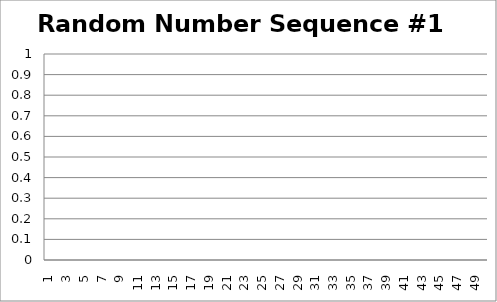
| Category | Random Number Sequence #1 |
|---|---|
| 1.0 | 0 |
| 2.0 | 0 |
| 3.0 | 0 |
| 4.0 | 0 |
| 5.0 | 0 |
| 6.0 | 0 |
| 7.0 | 0 |
| 8.0 | 0 |
| 9.0 | 0 |
| 10.0 | 0 |
| 11.0 | 0 |
| 12.0 | 0 |
| 13.0 | 0 |
| 14.0 | 0 |
| 15.0 | 0 |
| 16.0 | 0 |
| 17.0 | 0 |
| 18.0 | 0 |
| 19.0 | 0 |
| 20.0 | 0 |
| 21.0 | 0 |
| 22.0 | 0 |
| 23.0 | 0 |
| 24.0 | 0 |
| 25.0 | 0 |
| 26.0 | 0 |
| 27.0 | 0 |
| 28.0 | 0 |
| 29.0 | 0 |
| 30.0 | 0 |
| 31.0 | 0 |
| 32.0 | 0 |
| 33.0 | 0 |
| 34.0 | 0 |
| 35.0 | 0 |
| 36.0 | 0 |
| 37.0 | 0 |
| 38.0 | 0 |
| 39.0 | 0 |
| 40.0 | 0 |
| 41.0 | 0 |
| 42.0 | 0 |
| 43.0 | 0 |
| 44.0 | 0 |
| 45.0 | 0 |
| 46.0 | 0 |
| 47.0 | 0 |
| 48.0 | 0 |
| 49.0 | 0 |
| 50.0 | 0 |